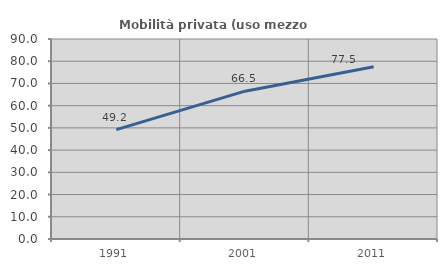
| Category | Mobilità privata (uso mezzo privato) |
|---|---|
| 1991.0 | 49.203 |
| 2001.0 | 66.528 |
| 2011.0 | 77.514 |